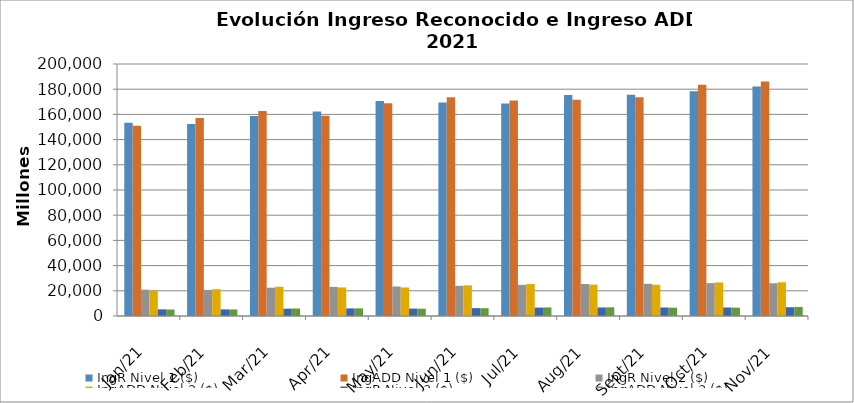
| Category | IngR Nivel 1 ($) | IngADD Nivel 1 ($) | IngR Nivel 2 ($) | IngADD Nivel 2 ($) | IngR Nivel 3 ($) | IngADD Nivel 3 ($) |
|---|---|---|---|---|---|---|
| 2021-01-01 | 153311328214 | 151041319422 | 20887226756 | 20215789912 | 5277270995 | 5141736010 |
| 2021-02-01 | 152377881923 | 157066466024 | 20663905993 | 21275223096 | 5248801087 | 5193528842 |
| 2021-03-01 | 158823535138 | 162636463138 | 22457716143 | 23201247103 | 5806393552 | 5923610482 |
| 2021-04-01 | 162336236468 | 158944048545 | 23118629079 | 22678467774 | 6024955926 | 6057244234 |
| 2021-05-01 | 170726146693 | 168815397074 | 23400333791 | 22651512771 | 5897978587 | 5764301258 |
| 2021-06-01 | 169357567642 | 173530480943 | 23928811117 | 24336693537 | 6242188617 | 6179047520 |
| 2021-07-01 | 168668759106 | 171041846460 | 24712619698 | 25356487417 | 6643474959 | 6791904809 |
| 2021-08-01 | 175486710435 | 171639411321 | 25399094517 | 24940736693 | 6791381116 | 6874698327 |
| 2021-09-01 | 175531960168 | 173683056035 | 25536246303 | 24806935184 | 6738754317 | 6594505722 |
| 2021-10-01 | 178385223449 | 183481558422 | 26087112251 | 26618538800 | 6720317418 | 6648271343 |
| 2021-11-01 | 182214597497 | 186125647293 | 26011084341 | 26753398378 | 6964054215 | 7169142868 |